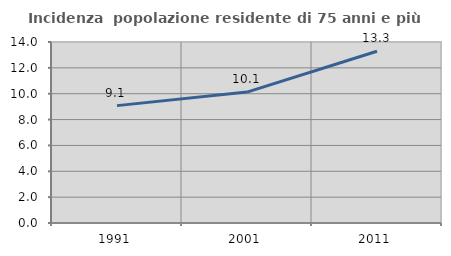
| Category | Incidenza  popolazione residente di 75 anni e più |
|---|---|
| 1991.0 | 9.078 |
| 2001.0 | 10.128 |
| 2011.0 | 13.287 |